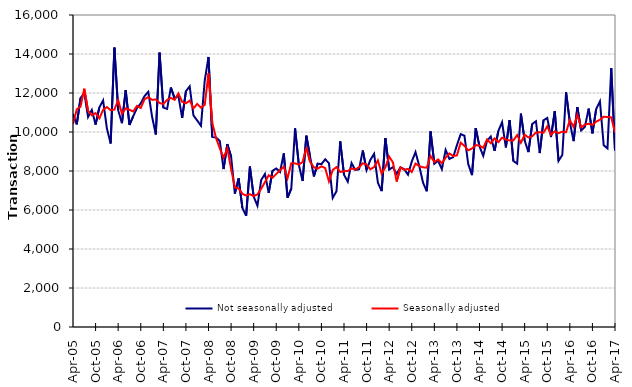
| Category | Not seasonally adjusted | Seasonally adjusted |
|---|---|---|
| 2005-04-01 | 10920 | 10410 |
| 2005-05-01 | 10390 | 11160 |
| 2005-06-01 | 11740 | 11300 |
| 2005-07-01 | 12000 | 12220 |
| 2005-08-01 | 10770 | 11090 |
| 2005-09-01 | 11130 | 10860 |
| 2005-10-01 | 10380 | 10970 |
| 2005-11-01 | 11260 | 10700 |
| 2005-12-01 | 11620 | 11140 |
| 2006-01-01 | 10190 | 11280 |
| 2006-02-01 | 9410 | 11120 |
| 2006-03-01 | 14330 | 11150 |
| 2006-04-01 | 11120 | 11630 |
| 2006-05-01 | 10450 | 10940 |
| 2006-06-01 | 12150 | 11210 |
| 2006-07-01 | 10360 | 11140 |
| 2006-08-01 | 10810 | 11050 |
| 2006-09-01 | 11230 | 11340 |
| 2006-10-01 | 11470 | 11230 |
| 2006-11-01 | 11840 | 11680 |
| 2006-12-01 | 12060 | 11790 |
| 2007-01-01 | 10790 | 11650 |
| 2007-02-01 | 9870 | 11670 |
| 2007-03-01 | 14070 | 11490 |
| 2007-04-01 | 11250 | 11430 |
| 2007-05-01 | 11180 | 11650 |
| 2007-06-01 | 12280 | 11750 |
| 2007-07-01 | 11720 | 11650 |
| 2007-08-01 | 11860 | 11980 |
| 2007-09-01 | 10720 | 11550 |
| 2007-10-01 | 12090 | 11470 |
| 2007-11-01 | 12340 | 11610 |
| 2007-12-01 | 10850 | 11210 |
| 2008-01-01 | 10590 | 11440 |
| 2008-02-01 | 10320 | 11250 |
| 2008-03-01 | 12640 | 11390 |
| 2008-04-01 | 13850 | 13010 |
| 2008-05-01 | 9750 | 10470 |
| 2008-06-01 | 9720 | 9690 |
| 2008-07-01 | 9540 | 9160 |
| 2008-08-01 | 8100 | 8680 |
| 2008-09-01 | 9380 | 9160 |
| 2008-10-01 | 8740 | 8110 |
| 2008-11-01 | 6840 | 7160 |
| 2008-12-01 | 7620 | 7100 |
| 2009-01-01 | 6110 | 6830 |
| 2009-02-01 | 5700 | 6740 |
| 2009-03-01 | 8230 | 6810 |
| 2009-04-01 | 6690 | 6710 |
| 2009-05-01 | 6220 | 6800 |
| 2009-06-01 | 7540 | 7090 |
| 2009-07-01 | 7850 | 7430 |
| 2009-08-01 | 6880 | 7780 |
| 2009-09-01 | 8010 | 7650 |
| 2009-10-01 | 8130 | 7850 |
| 2009-11-01 | 7950 | 8040 |
| 2009-12-01 | 8900 | 8220 |
| 2010-01-01 | 6630 | 7630 |
| 2010-02-01 | 7100 | 8400 |
| 2010-03-01 | 10190 | 8390 |
| 2010-04-01 | 8320 | 8330 |
| 2010-05-01 | 7490 | 8460 |
| 2010-06-01 | 9810 | 9200 |
| 2010-07-01 | 8720 | 8470 |
| 2010-08-01 | 7720 | 8190 |
| 2010-09-01 | 8380 | 8120 |
| 2010-10-01 | 8350 | 8240 |
| 2010-11-01 | 8600 | 8150 |
| 2010-12-01 | 8400 | 7470 |
| 2011-01-01 | 6620 | 8050 |
| 2011-02-01 | 6960 | 8200 |
| 2011-03-01 | 9520 | 7950 |
| 2011-04-01 | 7810 | 7990 |
| 2011-05-01 | 7450 | 8000 |
| 2011-06-01 | 8410 | 8130 |
| 2011-07-01 | 8050 | 8080 |
| 2011-08-01 | 8090 | 8190 |
| 2011-09-01 | 9050 | 8400 |
| 2011-10-01 | 8050 | 8330 |
| 2011-11-01 | 8570 | 8090 |
| 2011-12-01 | 8880 | 8200 |
| 2012-01-01 | 7400 | 8540 |
| 2012-02-01 | 6970 | 7870 |
| 2012-03-01 | 9690 | 8190 |
| 2012-04-01 | 8070 | 8740 |
| 2012-05-01 | 8200 | 8440 |
| 2012-06-01 | 7850 | 7460 |
| 2012-07-01 | 8190 | 8180 |
| 2012-08-01 | 8090 | 8060 |
| 2012-09-01 | 7810 | 8110 |
| 2012-10-01 | 8480 | 7950 |
| 2012-11-01 | 8970 | 8380 |
| 2012-12-01 | 8250 | 8250 |
| 2013-01-01 | 7400 | 8190 |
| 2013-02-01 | 6960 | 8170 |
| 2013-03-01 | 10030 | 8770 |
| 2013-04-01 | 8370 | 8460 |
| 2013-05-01 | 8530 | 8590 |
| 2013-06-01 | 8090 | 8400 |
| 2013-07-01 | 9080 | 8680 |
| 2013-08-01 | 8620 | 8900 |
| 2013-09-01 | 8710 | 8770 |
| 2013-10-01 | 9320 | 8800 |
| 2013-11-01 | 9890 | 9450 |
| 2013-12-01 | 9810 | 9290 |
| 2014-01-01 | 8360 | 9060 |
| 2014-02-01 | 7790 | 9150 |
| 2014-03-01 | 10200 | 9330 |
| 2014-04-01 | 9260 | 9300 |
| 2014-05-01 | 8780 | 9190 |
| 2014-06-01 | 9550 | 9620 |
| 2014-07-01 | 9770 | 9420 |
| 2014-08-01 | 9030 | 9670 |
| 2014-09-01 | 10050 | 9480 |
| 2014-10-01 | 10500 | 9710 |
| 2014-11-01 | 9210 | 9610 |
| 2014-12-01 | 10610 | 9570 |
| 2015-01-01 | 8510 | 9570 |
| 2015-02-01 | 8380 | 9840 |
| 2015-03-01 | 10940 | 9450 |
| 2015-04-01 | 9560 | 9860 |
| 2015-05-01 | 8970 | 9720 |
| 2015-06-01 | 10410 | 9780 |
| 2015-07-01 | 10550 | 9970 |
| 2015-08-01 | 8920 | 9990 |
| 2015-09-01 | 10600 | 9960 |
| 2015-10-01 | 10720 | 10290 |
| 2015-11-01 | 9740 | 9860 |
| 2015-12-01 | 11070 | 10040 |
| 2016-01-01 | 8520 | 9940 |
| 2016-02-01 | 8820 | 10020 |
| 2016-03-01 | 12040 | 9990 |
| 2016-04-01 | 10500 | 10610 |
| 2016-05-01 | 9530 | 10260 |
| 2016-06-01 | 11270 | 10880 |
| 2016-07-01 | 10080 | 10230 |
| 2016-08-01 | 10260 | 10380 |
| 2016-09-01 | 11200 | 10420 |
| 2016-10-01 | 9930 | 10360 |
| 2016-11-01 | 11180 | 10530 |
| 2016-12-01 | 11570 | 10630 |
| 2017-01-01 | 9320 | 10780 |
| 2017-02-01 | 9160 | 10770 |
| 2017-03-01 | 13280 | 10750 |
| 2017-04-01 | 9050 | 9980 |